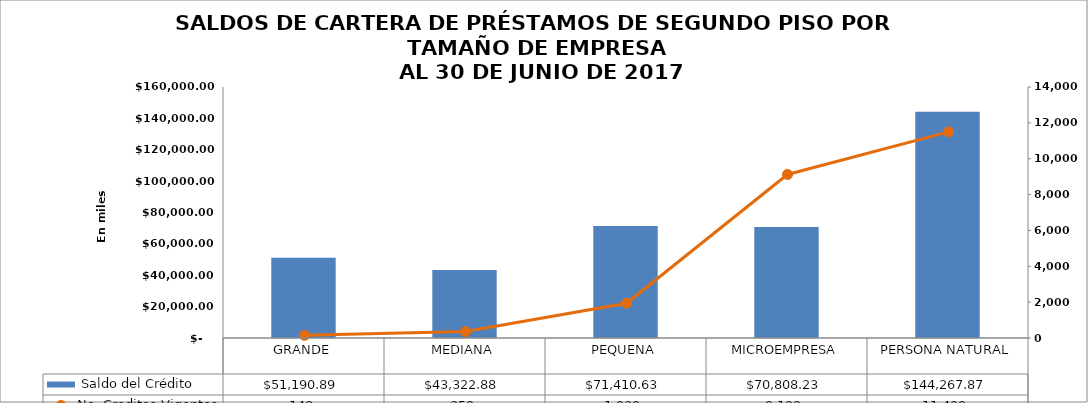
| Category |  Saldo del Crédito |
|---|---|
| GRANDE | 51190.893 |
| MEDIANA | 43322.88 |
| PEQUENA | 71410.628 |
| MICROEMPRESA | 70808.234 |
| PERSONA NATURAL | 144267.869 |